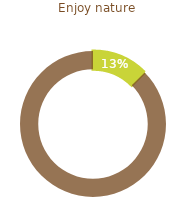
| Category | Enjoy nature |
|---|---|
| 0 | 0.125 |
| 1 | 0.875 |